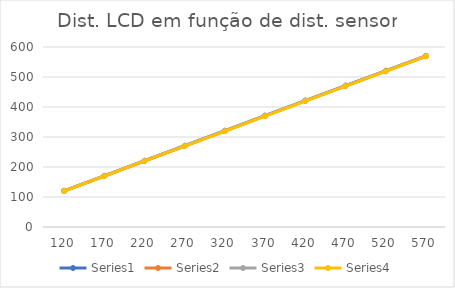
| Category | Series 0 | Series 1 | Series 2 | Series 3 |
|---|---|---|---|---|
| 120.0 | 120.58 | 119.99 | 120.58 | 119.99 |
| 170.0 | 170.67 | 170.09 | 170.09 | 169.51 |
| 220.0 | 220.77 | 219.6 | 220.77 | 220.19 |
| 270.0 | 270.86 | 269.7 | 270.86 | 269.7 |
| 320.0 | 320.96 | 319.79 | 320.38 | 319.79 |
| 370.0 | 371.05 | 370.47 | 371.05 | 369.89 |
| 420.0 | 421.15 | 420.57 | 421.15 | 419.4 |
| 470.0 | 471.24 | 470.08 | 470.66 | 469.5 |
| 520.0 | 520.17 | 519.59 | 521.34 | 519.01 |
| 570.0 | 570.27 | 569.1 | 570.27 | 569.69 |